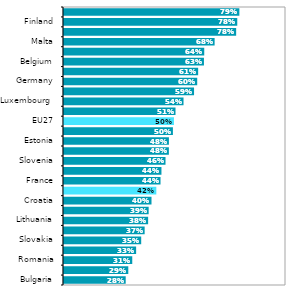
| Category | Series 0 |
|---|---|
| Bulgaria | 0.282 |
| Hungary | 0.294 |
| Romania | 0.312 |
| Greece | 0.329 |
| Slovakia | 0.352 |
| Poland | 0.368 |
| Lithuania | 0.383 |
| Latvia | 0.386 |
| Croatia | 0.399 |
| Czechia | 0.42 |
| France | 0.439 |
| Italy | 0.443 |
| Slovenia | 0.462 |
| Portugal | 0.477 |
| Estonia | 0.477 |
| Austria | 0.495 |
| EU27 | 0.5 |
| Spain | 0.507 |
| Luxembourg  | 0.543 |
| Cyprus | 0.59 |
| Germany | 0.605 |
| Netherlands | 0.609 |
| Belgium | 0.635 |
| Ireland | 0.636 |
| Malta | 0.683 |
| Denmark | 0.78 |
| Finland | 0.785 |
| Sweden | 0.794 |